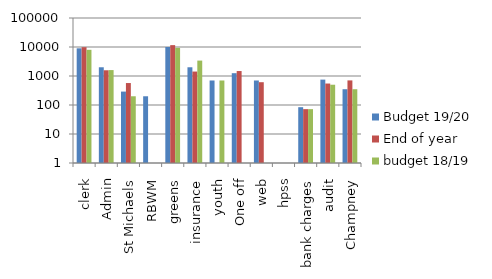
| Category | Budget 19/20 | End of year | budget 18/19 |
|---|---|---|---|
| clerk | 9000 | 9857.22 | 8000 |
| Admin | 2000 | 1576.25 | 1600 |
| St Michaels | 290 | 572 | 200 |
| RBWM | 200 | 1 | 1 |
| greens | 10000 | 11594.29 | 9335 |
| insurance | 2000 | 1423.42 | 3400 |
| youth | 700 | 1 | 700 |
| One off | 1250 | 1482.81 | 1 |
| web | 700 | 611 | 1 |
| hpss | 1 | 1 | 1 |
| bank charges | 84 | 72 | 72 |
| audit | 750 | 550 | 500 |
| Champney | 350 | 705.13 | 350 |